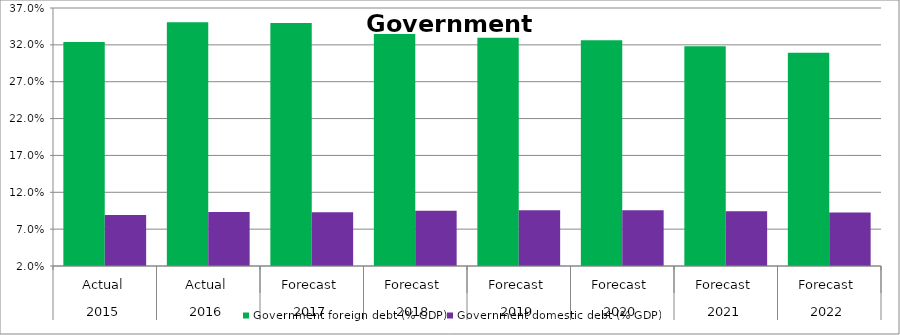
| Category | Government foreign debt (% GDP) | Government domestic debt (% GDP) |
|---|---|---|
| 0 | 0.324 | 0.089 |
| 1 | 0.351 | 0.093 |
| 2 | 0.35 | 0.093 |
| 3 | 0.335 | 0.095 |
| 4 | 0.33 | 0.096 |
| 5 | 0.326 | 0.096 |
| 6 | 0.318 | 0.094 |
| 7 | 0.309 | 0.093 |